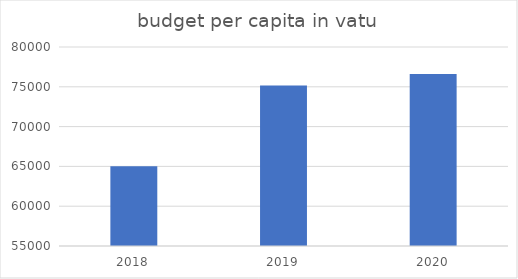
| Category | budget per capita in vatu per student |
|---|---|
| 2018.0 | 65018.863 |
| 2019.0 | 75154.172 |
| 2020.0 | 76599.77 |